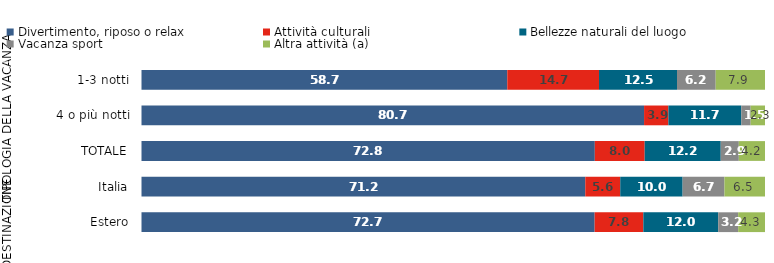
| Category | Divertimento, riposo o relax                 | Attività culturali | Bellezze naturali del luogo          | Vacanza sport                                 | Altra attività (a)        |
|---|---|---|---|---|---|
| 0 | 58.7 | 14.7 | 12.5 | 6.2 | 7.9 |
| 1 | 80.7 | 3.9 | 11.7 | 1.5 | 2.3 |
| 2 | 72.8 | 8 | 12.2 | 2.9 | 4.2 |
| 3 | 71.2 | 5.6 | 10 | 6.7 | 6.5 |
| 4 | 72.7 | 7.8 | 12 | 3.2 | 4.3 |